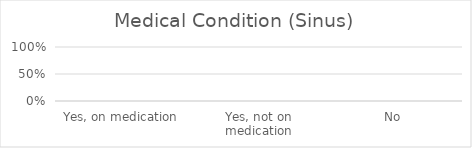
| Category | Sinus |
|---|---|
| Yes, on medication | 0 |
| Yes, not on medication | 0 |
| No | 0 |